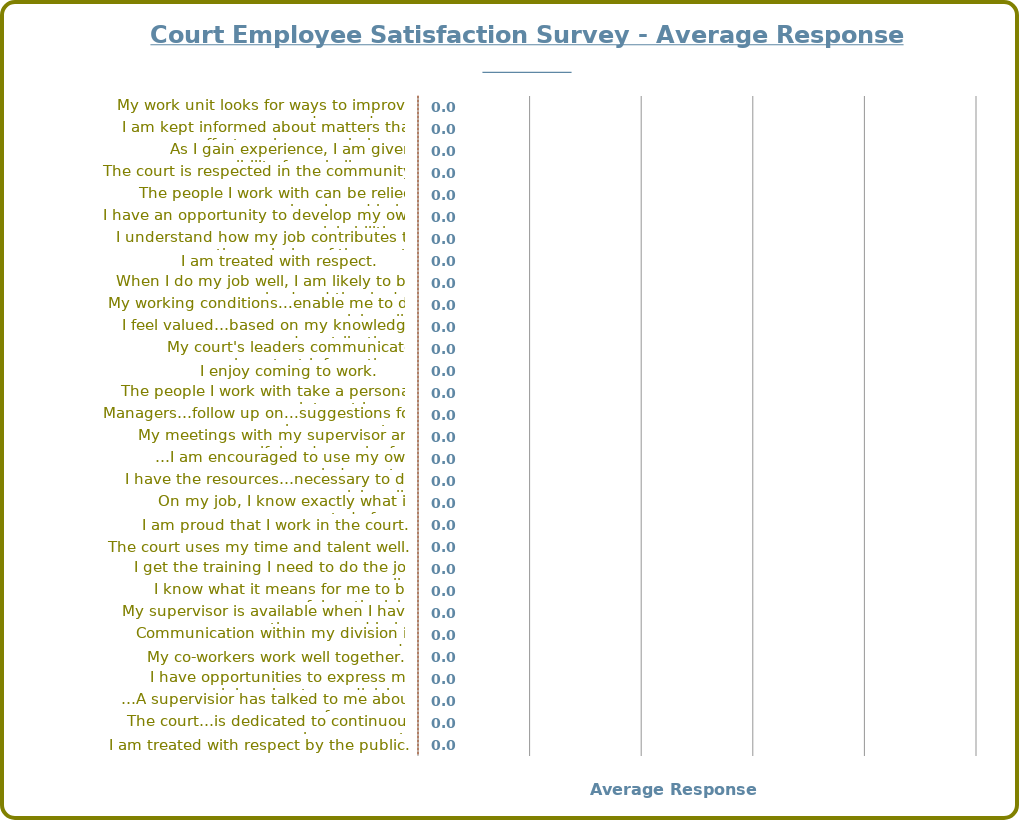
| Category | Series 0 |
|---|---|
| My work unit looks for ways to improve processes and procedures. | 0 |
| I am kept informed about matters that affect me in my workplace.   | 0 |
| As I gain experience, I am given responsibility for...challenges… | 0 |
| The court is respected in the community.       | 0 |
| The people I work with can be relied upon when I need help. | 0 |
| I have an opportunity to develop my own special abilities. | 0 |
| I understand how my job contributes to the…mission of the court. | 0 |
| I am treated with respect.       | 0 |
| When I do my job well, I am likely to be recognized and thanked… | 0 |
| My working conditions...enable me to do my job well. | 0 |
| I feel valued…based on my knowledge and contribution… | 0 |
| My court's leaders communicate inportant information… | 0 |
| I enjoy coming to work.       | 0 |
| The people I work with take a personal interest in me. | 0 |
| Managers…follow up on...suggestions for improvements… | 0 |
| My meetings with my supervisor are uselful and meaningful. | 0 |
| …I am encouraged to use my own judgment… | 0 |
| I have the resources…necessary to do my job well. | 0 |
| On my job, I know exactly what is expected of me. | 0 |
| I am proud that I work in the court. | 0 |
| The court uses my time and talent well. | 0 |
| I get the training I need to do the job well. | 0 |
| I know what it means for me to be successful on the job. | 0 |
| My supervisor is available when I have questions or need help. | 0 |
| Communication within my division is good. | 0 |
| My co-workers work well together. | 0 |
| I have opportunities to express my opinion about…my division. | 0 |
| …A supervisior has talked to me about my performance… | 0 |
| The court…is dedicated to continuous improvement. | 0 |
| I am treated with respect by the public. | 0 |